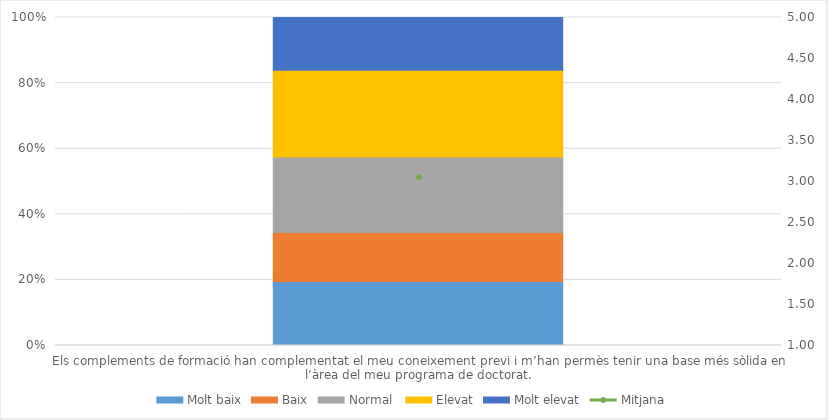
| Category | Molt baix | Baix | Normal  | Elevat | Molt elevat |
|---|---|---|---|---|---|
| Els complements de formació han complementat el meu coneixement previ i m’han permès tenir una base més sòlida en l’àrea del meu programa de doctorat. | 17 | 13 | 20 | 23 | 14 |